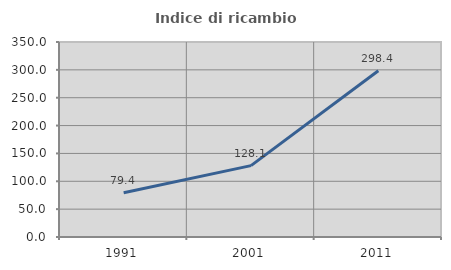
| Category | Indice di ricambio occupazionale  |
|---|---|
| 1991.0 | 79.365 |
| 2001.0 | 128.05 |
| 2011.0 | 298.356 |